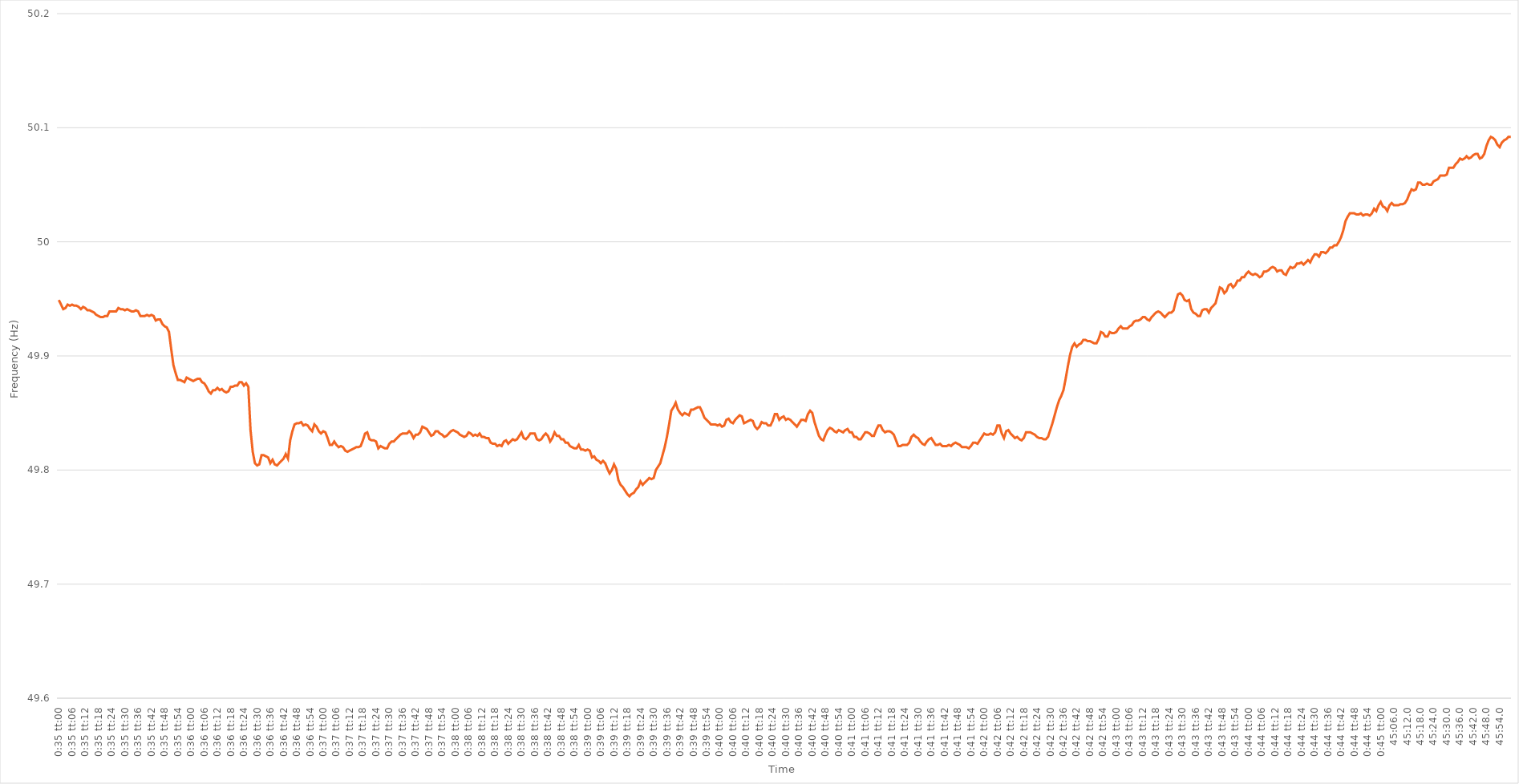
| Category | Series 0 |
|---|---|
| 0.024305555555555556 | 49.949 |
| 0.02431712962962963 | 49.945 |
| 0.024328703703703703 | 49.941 |
| 0.024340277777777777 | 49.942 |
| 0.024351851851851857 | 49.945 |
| 0.024363425925925927 | 49.944 |
| 0.024375000000000004 | 49.945 |
| 0.024386574074074074 | 49.944 |
| 0.024398148148148145 | 49.944 |
| 0.02440972222222222 | 49.943 |
| 0.02442129629629629 | 49.941 |
| 0.02443287037037037 | 49.943 |
| 0.024444444444444446 | 49.942 |
| 0.02445601851851852 | 49.94 |
| 0.024467592592592593 | 49.94 |
| 0.024479166666666666 | 49.939 |
| 0.02449074074074074 | 49.938 |
| 0.024502314814814814 | 49.936 |
| 0.024513888888888887 | 49.935 |
| 0.024525462962962968 | 49.934 |
| 0.024537037037037038 | 49.934 |
| 0.024548611111111115 | 49.935 |
| 0.024560185185185185 | 49.935 |
| 0.024571759259259262 | 49.939 |
| 0.024583333333333332 | 49.939 |
| 0.02459490740740741 | 49.939 |
| 0.02460648148148148 | 49.939 |
| 0.02461805555555556 | 49.942 |
| 0.02462962962962963 | 49.941 |
| 0.024641203703703703 | 49.941 |
| 0.024652777777777777 | 49.94 |
| 0.02466435185185185 | 49.941 |
| 0.024675925925925924 | 49.94 |
| 0.024687499999999998 | 49.939 |
| 0.024699074074074078 | 49.939 |
| 0.024710648148148148 | 49.94 |
| 0.024722222222222225 | 49.939 |
| 0.024733796296296295 | 49.935 |
| 0.024745370370370372 | 49.935 |
| 0.024756944444444443 | 49.935 |
| 0.02476851851851852 | 49.936 |
| 0.02478009259259259 | 49.935 |
| 0.02479166666666667 | 49.936 |
| 0.02480324074074074 | 49.935 |
| 0.024814814814814817 | 49.931 |
| 0.024826388888888887 | 49.932 |
| 0.024837962962962964 | 49.932 |
| 0.024849537037037035 | 49.928 |
| 0.024861111111111108 | 49.926 |
| 0.02487268518518519 | 49.925 |
| 0.02488425925925926 | 49.921 |
| 0.024895833333333336 | 49.906 |
| 0.024907407407407406 | 49.892 |
| 0.024918981481481483 | 49.885 |
| 0.024930555555555553 | 49.879 |
| 0.02494212962962963 | 49.879 |
| 0.0249537037037037 | 49.878 |
| 0.02496527777777778 | 49.877 |
| 0.02497685185185185 | 49.881 |
| 0.024988425925925928 | 49.88 |
| 0.024999999999999998 | 49.879 |
| 0.025011574074074075 | 49.878 |
| 0.025023148148148145 | 49.879 |
| 0.025034722222222222 | 49.88 |
| 0.0250462962962963 | 49.88 |
| 0.025057870370370373 | 49.877 |
| 0.025069444444444446 | 49.876 |
| 0.02508101851851852 | 49.873 |
| 0.025092592592592593 | 49.869 |
| 0.025104166666666664 | 49.867 |
| 0.02511574074074074 | 49.87 |
| 0.02512731481481481 | 49.87 |
| 0.02513888888888889 | 49.872 |
| 0.02515046296296296 | 49.87 |
| 0.02516203703703704 | 49.871 |
| 0.02517361111111111 | 49.869 |
| 0.025185185185185185 | 49.868 |
| 0.025196759259259256 | 49.869 |
| 0.025208333333333333 | 49.873 |
| 0.02521990740740741 | 49.873 |
| 0.025231481481481483 | 49.874 |
| 0.025243055555555557 | 49.874 |
| 0.02525462962962963 | 49.877 |
| 0.025266203703703704 | 49.877 |
| 0.025277777777777777 | 49.874 |
| 0.02528935185185185 | 49.876 |
| 0.025300925925925925 | 49.873 |
| 0.0253125 | 49.835 |
| 0.02532407407407408 | 49.816 |
| 0.02533564814814815 | 49.806 |
| 0.02534722222222222 | 49.804 |
| 0.025358796296296296 | 49.805 |
| 0.025370370370370366 | 49.813 |
| 0.025381944444444443 | 49.813 |
| 0.02539351851851852 | 49.812 |
| 0.025405092592592594 | 49.811 |
| 0.025416666666666667 | 49.806 |
| 0.02542824074074074 | 49.809 |
| 0.025439814814814814 | 49.805 |
| 0.025451388888888888 | 49.804 |
| 0.02546296296296296 | 49.806 |
| 0.025474537037037035 | 49.808 |
| 0.025486111111111112 | 49.81 |
| 0.02549768518518519 | 49.814 |
| 0.02550925925925926 | 49.81 |
| 0.025520833333333336 | 49.826 |
| 0.025532407407407406 | 49.834 |
| 0.025543981481481483 | 49.84 |
| 0.025555555555555554 | 49.841 |
| 0.025567129629629634 | 49.841 |
| 0.025578703703703704 | 49.842 |
| 0.025590277777777778 | 49.839 |
| 0.02560185185185185 | 49.84 |
| 0.025613425925925925 | 49.839 |
| 0.025625 | 49.836 |
| 0.025636574074074072 | 49.834 |
| 0.025648148148148146 | 49.84 |
| 0.025659722222222223 | 49.838 |
| 0.0256712962962963 | 49.834 |
| 0.02568287037037037 | 49.832 |
| 0.025694444444444447 | 49.834 |
| 0.025706018518518517 | 49.833 |
| 0.025717592592592594 | 49.828 |
| 0.025729166666666664 | 49.822 |
| 0.025740740740740745 | 49.822 |
| 0.025752314814814815 | 49.825 |
| 0.02576388888888889 | 49.822 |
| 0.025775462962962962 | 49.82 |
| 0.02578703703703704 | 49.821 |
| 0.02579861111111111 | 49.82 |
| 0.025810185185185183 | 49.817 |
| 0.025821759259259256 | 49.816 |
| 0.025833333333333333 | 49.817 |
| 0.02584490740740741 | 49.818 |
| 0.02585648148148148 | 49.819 |
| 0.025868055555555557 | 49.82 |
| 0.025879629629629627 | 49.82 |
| 0.025891203703703704 | 49.821 |
| 0.025902777777777775 | 49.826 |
| 0.025914351851851855 | 49.832 |
| 0.025925925925925925 | 49.833 |
| 0.025937500000000002 | 49.827 |
| 0.025949074074074072 | 49.826 |
| 0.02596064814814815 | 49.826 |
| 0.02597222222222222 | 49.825 |
| 0.025983796296296297 | 49.819 |
| 0.025995370370370367 | 49.821 |
| 0.026006944444444447 | 49.82 |
| 0.02601851851851852 | 49.819 |
| 0.026030092592592594 | 49.819 |
| 0.026041666666666668 | 49.823 |
| 0.026053240740740738 | 49.825 |
| 0.026064814814814815 | 49.825 |
| 0.026076388888888885 | 49.827 |
| 0.026087962962962966 | 49.829 |
| 0.026099537037037036 | 49.831 |
| 0.026111111111111113 | 49.832 |
| 0.026122685185185183 | 49.832 |
| 0.02613425925925926 | 49.832 |
| 0.02614583333333333 | 49.834 |
| 0.026157407407407407 | 49.832 |
| 0.026168981481481477 | 49.828 |
| 0.026180555555555558 | 49.831 |
| 0.02619212962962963 | 49.831 |
| 0.026203703703703705 | 49.833 |
| 0.02621527777777778 | 49.838 |
| 0.026226851851851852 | 49.837 |
| 0.026238425925925925 | 49.836 |
| 0.02625 | 49.833 |
| 0.026261574074074076 | 49.83 |
| 0.026273148148148153 | 49.831 |
| 0.026284722222222223 | 49.834 |
| 0.026296296296296293 | 49.834 |
| 0.02630787037037037 | 49.832 |
| 0.02631944444444444 | 49.831 |
| 0.026331018518518517 | 49.829 |
| 0.026342592592592588 | 49.83 |
| 0.026354166666666668 | 49.832 |
| 0.02636574074074074 | 49.834 |
| 0.026377314814814815 | 49.835 |
| 0.02638888888888889 | 49.834 |
| 0.026400462962962962 | 49.833 |
| 0.026412037037037036 | 49.831 |
| 0.02642361111111111 | 49.83 |
| 0.026435185185185187 | 49.829 |
| 0.026446759259259264 | 49.83 |
| 0.026458333333333334 | 49.833 |
| 0.02646990740740741 | 49.832 |
| 0.02648148148148148 | 49.83 |
| 0.026493055555555558 | 49.831 |
| 0.026504629629629628 | 49.83 |
| 0.026516203703703698 | 49.832 |
| 0.02652777777777778 | 49.829 |
| 0.026539351851851852 | 49.829 |
| 0.026550925925925926 | 49.828 |
| 0.0265625 | 49.828 |
| 0.026574074074074073 | 49.824 |
| 0.026585648148148146 | 49.823 |
| 0.02659722222222222 | 49.823 |
| 0.026608796296296297 | 49.821 |
| 0.026620370370370374 | 49.822 |
| 0.026631944444444444 | 49.821 |
| 0.02664351851851852 | 49.825 |
| 0.02665509259259259 | 49.826 |
| 0.02666666666666667 | 49.823 |
| 0.02667824074074074 | 49.825 |
| 0.026689814814814816 | 49.827 |
| 0.02670138888888889 | 49.826 |
| 0.026712962962962966 | 49.827 |
| 0.026724537037037036 | 49.83 |
| 0.026736111111111113 | 49.833 |
| 0.026747685185185183 | 49.828 |
| 0.026759259259259257 | 49.827 |
| 0.02677083333333333 | 49.829 |
| 0.026782407407407408 | 49.832 |
| 0.026793981481481485 | 49.832 |
| 0.026805555555555555 | 49.832 |
| 0.02681712962962963 | 49.827 |
| 0.026828703703703702 | 49.826 |
| 0.02684027777777778 | 49.827 |
| 0.02685185185185185 | 49.83 |
| 0.026863425925925926 | 49.832 |
| 0.026875 | 49.83 |
| 0.026886574074074077 | 49.825 |
| 0.026898148148148147 | 49.828 |
| 0.026909722222222224 | 49.833 |
| 0.026921296296296294 | 49.83 |
| 0.02693287037037037 | 49.83 |
| 0.02694444444444444 | 49.827 |
| 0.02695601851851852 | 49.827 |
| 0.026967592592592595 | 49.824 |
| 0.02697916666666667 | 49.824 |
| 0.026990740740740742 | 49.821 |
| 0.027002314814814812 | 49.82 |
| 0.02701388888888889 | 49.819 |
| 0.02702546296296296 | 49.819 |
| 0.027037037037037037 | 49.822 |
| 0.02704861111111111 | 49.818 |
| 0.027060185185185187 | 49.818 |
| 0.027071759259259257 | 49.817 |
| 0.027083333333333334 | 49.818 |
| 0.027094907407407404 | 49.817 |
| 0.02710648148148148 | 49.811 |
| 0.02711805555555555 | 49.812 |
| 0.027129629629629632 | 49.809 |
| 0.027141203703703706 | 49.808 |
| 0.02715277777777778 | 49.806 |
| 0.027164351851851853 | 49.808 |
| 0.027175925925925926 | 49.806 |
| 0.0271875 | 49.801 |
| 0.027199074074074073 | 49.797 |
| 0.027210648148148147 | 49.8 |
| 0.027222222222222228 | 49.805 |
| 0.027233796296296298 | 49.801 |
| 0.027245370370370368 | 49.791 |
| 0.027256944444444445 | 49.787 |
| 0.027268518518518515 | 49.785 |
| 0.027280092592592592 | 49.782 |
| 0.027291666666666662 | 49.779 |
| 0.027303240740740743 | 49.777 |
| 0.027314814814814816 | 49.779 |
| 0.02732638888888889 | 49.78 |
| 0.027337962962962963 | 49.783 |
| 0.027349537037037037 | 49.785 |
| 0.02736111111111111 | 49.79 |
| 0.027372685185185184 | 49.787 |
| 0.027384259259259257 | 49.789 |
| 0.027395833333333338 | 49.791 |
| 0.027407407407407408 | 49.793 |
| 0.027418981481481485 | 49.792 |
| 0.027430555555555555 | 49.793 |
| 0.027442129629629632 | 49.8 |
| 0.027453703703703702 | 49.803 |
| 0.027465277777777772 | 49.806 |
| 0.027476851851851853 | 49.813 |
| 0.027488425925925927 | 49.82 |
| 0.0275 | 49.829 |
| 0.027511574074074074 | 49.84 |
| 0.027523148148148147 | 49.852 |
| 0.02753472222222222 | 49.855 |
| 0.027546296296296294 | 49.859 |
| 0.027557870370370368 | 49.853 |
| 0.02756944444444445 | 49.85 |
| 0.02758101851851852 | 49.848 |
| 0.027592592592592596 | 49.85 |
| 0.027604166666666666 | 49.849 |
| 0.027615740740740743 | 49.848 |
| 0.027627314814814813 | 49.853 |
| 0.02763888888888889 | 49.853 |
| 0.027650462962962963 | 49.854 |
| 0.02766203703703704 | 49.855 |
| 0.02767361111111111 | 49.855 |
| 0.027685185185185188 | 49.851 |
| 0.027696759259259258 | 49.846 |
| 0.02770833333333333 | 49.844 |
| 0.027719907407407405 | 49.842 |
| 0.02773148148148148 | 49.84 |
| 0.02774305555555556 | 49.84 |
| 0.02775462962962963 | 49.84 |
| 0.027766203703703706 | 49.839 |
| 0.027777777777777776 | 49.84 |
| 0.027789351851851853 | 49.838 |
| 0.027800925925925923 | 49.839 |
| 0.0278125 | 49.844 |
| 0.027824074074074074 | 49.845 |
| 0.02783564814814815 | 49.842 |
| 0.02784722222222222 | 49.841 |
| 0.027858796296296298 | 49.844 |
| 0.02787037037037037 | 49.846 |
| 0.027881944444444445 | 49.848 |
| 0.027893518518518515 | 49.847 |
| 0.027905092592592592 | 49.841 |
| 0.02791666666666667 | 49.842 |
| 0.027928240740740743 | 49.843 |
| 0.027939814814814817 | 49.844 |
| 0.027951388888888887 | 49.843 |
| 0.027962962962962964 | 49.838 |
| 0.027974537037037034 | 49.836 |
| 0.02798611111111111 | 49.838 |
| 0.027997685185185184 | 49.842 |
| 0.02800925925925926 | 49.841 |
| 0.02802083333333333 | 49.841 |
| 0.02803240740740741 | 49.839 |
| 0.02804398148148148 | 49.839 |
| 0.028055555555555556 | 49.843 |
| 0.028067129629629626 | 49.849 |
| 0.028078703703703703 | 49.849 |
| 0.02809027777777778 | 49.844 |
| 0.028101851851851854 | 49.846 |
| 0.028113425925925927 | 49.847 |
| 0.028125 | 49.844 |
| 0.028136574074074074 | 49.845 |
| 0.028148148148148148 | 49.844 |
| 0.02815972222222222 | 49.842 |
| 0.028171296296296302 | 49.84 |
| 0.028182870370370372 | 49.838 |
| 0.028194444444444442 | 49.841 |
| 0.02820601851851852 | 49.844 |
| 0.02821759259259259 | 49.844 |
| 0.028229166666666666 | 49.843 |
| 0.028240740740740736 | 49.849 |
| 0.028252314814814813 | 49.852 |
| 0.02826388888888889 | 49.85 |
| 0.028275462962962964 | 49.842 |
| 0.028287037037037038 | 49.836 |
| 0.02829861111111111 | 49.83 |
| 0.028310185185185185 | 49.827 |
| 0.02832175925925926 | 49.826 |
| 0.028333333333333332 | 49.831 |
| 0.028344907407407412 | 49.835 |
| 0.028356481481481483 | 49.837 |
| 0.02836805555555556 | 49.836 |
| 0.02837962962962963 | 49.834 |
| 0.028391203703703707 | 49.833 |
| 0.028402777777777777 | 49.835 |
| 0.028414351851851847 | 49.834 |
| 0.028425925925925924 | 49.833 |
| 0.0284375 | 49.835 |
| 0.028449074074074075 | 49.836 |
| 0.028460648148148148 | 49.833 |
| 0.02847222222222222 | 49.833 |
| 0.028483796296296295 | 49.829 |
| 0.02849537037037037 | 49.829 |
| 0.028506944444444442 | 49.827 |
| 0.028518518518518523 | 49.827 |
| 0.028530092592592593 | 49.83 |
| 0.02854166666666667 | 49.833 |
| 0.02855324074074074 | 49.833 |
| 0.028564814814814817 | 49.832 |
| 0.028576388888888887 | 49.83 |
| 0.028587962962962964 | 49.83 |
| 0.028599537037037034 | 49.835 |
| 0.028611111111111115 | 49.839 |
| 0.028622685185185185 | 49.839 |
| 0.028634259259259262 | 49.835 |
| 0.028645833333333332 | 49.833 |
| 0.028657407407407406 | 49.834 |
| 0.02866898148148148 | 49.834 |
| 0.028680555555555553 | 49.833 |
| 0.028692129629629633 | 49.831 |
| 0.028703703703703703 | 49.826 |
| 0.02871527777777778 | 49.821 |
| 0.02872685185185185 | 49.821 |
| 0.028738425925925928 | 49.822 |
| 0.028749999999999998 | 49.822 |
| 0.028761574074074075 | 49.822 |
| 0.028773148148148145 | 49.824 |
| 0.028784722222222225 | 49.829 |
| 0.028796296296296296 | 49.831 |
| 0.028807870370370373 | 49.829 |
| 0.028819444444444443 | 49.828 |
| 0.02883101851851852 | 49.825 |
| 0.02884259259259259 | 49.823 |
| 0.028854166666666667 | 49.822 |
| 0.028865740740740744 | 49.825 |
| 0.028877314814814817 | 49.827 |
| 0.02888888888888889 | 49.828 |
| 0.02890046296296296 | 49.825 |
| 0.028912037037037038 | 49.822 |
| 0.02892361111111111 | 49.822 |
| 0.028935185185185185 | 49.823 |
| 0.028946759259259255 | 49.821 |
| 0.028958333333333336 | 49.821 |
| 0.028969907407407406 | 49.821 |
| 0.028981481481481483 | 49.822 |
| 0.028993055555555553 | 49.821 |
| 0.02900462962962963 | 49.823 |
| 0.0290162037037037 | 49.824 |
| 0.029027777777777777 | 49.823 |
| 0.029039351851851854 | 49.822 |
| 0.029050925925925928 | 49.82 |
| 0.0290625 | 49.82 |
| 0.029074074074074075 | 49.82 |
| 0.02908564814814815 | 49.819 |
| 0.029097222222222222 | 49.821 |
| 0.029108796296296296 | 49.824 |
| 0.029120370370370366 | 49.824 |
| 0.029131944444444446 | 49.823 |
| 0.029143518518518517 | 49.826 |
| 0.029155092592592594 | 49.829 |
| 0.029166666666666664 | 49.832 |
| 0.02917824074074074 | 49.831 |
| 0.02918981481481481 | 49.831 |
| 0.029201388888888888 | 49.832 |
| 0.029212962962962965 | 49.831 |
| 0.02922453703703704 | 49.833 |
| 0.029236111111111112 | 49.839 |
| 0.029247685185185186 | 49.839 |
| 0.02925925925925926 | 49.832 |
| 0.029270833333333333 | 49.828 |
| 0.029282407407407406 | 49.834 |
| 0.02929398148148148 | 49.835 |
| 0.029305555555555557 | 49.832 |
| 0.029317129629629634 | 49.83 |
| 0.029328703703703704 | 49.828 |
| 0.02934027777777778 | 49.829 |
| 0.02935185185185185 | 49.827 |
| 0.02936342592592592 | 49.826 |
| 0.029375 | 49.828 |
| 0.029386574074074075 | 49.833 |
| 0.02939814814814815 | 49.833 |
| 0.029409722222222223 | 49.833 |
| 0.029421296296296296 | 49.832 |
| 0.02943287037037037 | 49.831 |
| 0.029444444444444443 | 49.829 |
| 0.029456018518518517 | 49.828 |
| 0.02946759259259259 | 49.828 |
| 0.029479166666666667 | 49.827 |
| 0.029490740740740744 | 49.827 |
| 0.029502314814814815 | 49.829 |
| 0.02951388888888889 | 49.835 |
| 0.02952546296296296 | 49.841 |
| 0.02953703703703704 | 49.848 |
| 0.02954861111111111 | 49.855 |
| 0.02956018518518519 | 49.861 |
| 0.02957175925925926 | 49.865 |
| 0.029583333333333336 | 49.87 |
| 0.029594907407407407 | 49.88 |
| 0.02960648148148148 | 49.891 |
| 0.029618055555555554 | 49.901 |
| 0.029629629629629627 | 49.908 |
| 0.0296412037037037 | 49.911 |
| 0.029652777777777778 | 49.908 |
| 0.029664351851851855 | 49.91 |
| 0.029675925925925925 | 49.911 |
| 0.029687500000000002 | 49.914 |
| 0.029699074074074072 | 49.914 |
| 0.02971064814814815 | 49.913 |
| 0.02972222222222222 | 49.913 |
| 0.0297337962962963 | 49.912 |
| 0.02974537037037037 | 49.911 |
| 0.029756944444444447 | 49.911 |
| 0.029768518518518517 | 49.915 |
| 0.029780092592592594 | 49.921 |
| 0.029791666666666664 | 49.92 |
| 0.02980324074074074 | 49.917 |
| 0.02981481481481481 | 49.917 |
| 0.029826388888888892 | 49.921 |
| 0.029837962962962965 | 49.92 |
| 0.029849537037037036 | 49.92 |
| 0.029861111111111113 | 49.921 |
| 0.029872685185185183 | 49.924 |
| 0.02988425925925926 | 49.926 |
| 0.02989583333333333 | 49.924 |
| 0.02990740740740741 | 49.924 |
| 0.02991898148148148 | 49.924 |
| 0.029930555555555557 | 49.926 |
| 0.029942129629629628 | 49.927 |
| 0.029953703703703705 | 49.93 |
| 0.029965277777777775 | 49.931 |
| 0.029976851851851852 | 49.931 |
| 0.029988425925925922 | 49.932 |
| 0.030000000000000002 | 49.934 |
| 0.030011574074074076 | 49.934 |
| 0.03002314814814815 | 49.932 |
| 0.030034722222222223 | 49.931 |
| 0.030046296296296297 | 49.934 |
| 0.03005787037037037 | 49.936 |
| 0.03006944444444444 | 49.938 |
| 0.03008101851851852 | 49.939 |
| 0.03009259259259259 | 49.938 |
| 0.030104166666666668 | 49.936 |
| 0.030115740740740738 | 49.934 |
| 0.030127314814814815 | 49.936 |
| 0.030138888888888885 | 49.938 |
| 0.030150462962962962 | 49.938 |
| 0.030162037037037032 | 49.94 |
| 0.030173611111111113 | 49.948 |
| 0.030185185185185186 | 49.954 |
| 0.03019675925925926 | 49.955 |
| 0.030208333333333334 | 49.953 |
| 0.030219907407407407 | 49.949 |
| 0.03023148148148148 | 49.948 |
| 0.030243055555555554 | 49.949 |
| 0.03025462962962963 | 49.941 |
| 0.03026620370370371 | 49.938 |
| 0.03027777777777778 | 49.937 |
| 0.030289351851851855 | 49.935 |
| 0.030300925925925926 | 49.935 |
| 0.030312499999999996 | 49.94 |
| 0.030324074074074073 | 49.941 |
| 0.030335648148148143 | 49.941 |
| 0.030347222222222223 | 49.938 |
| 0.030358796296296297 | 49.942 |
| 0.03037037037037037 | 49.944 |
| 0.030381944444444444 | 49.946 |
| 0.030393518518518518 | 49.953 |
| 0.03040509259259259 | 49.96 |
| 0.030416666666666665 | 49.959 |
| 0.030428240740740742 | 49.955 |
| 0.03043981481481482 | 49.957 |
| 0.03045138888888889 | 49.962 |
| 0.030462962962962966 | 49.963 |
| 0.030474537037037036 | 49.96 |
| 0.030486111111111113 | 49.962 |
| 0.030497685185185183 | 49.966 |
| 0.03050925925925926 | 49.966 |
| 0.030520833333333334 | 49.969 |
| 0.03053240740740741 | 49.969 |
| 0.03054398148148148 | 49.972 |
| 0.030555555555555555 | 49.974 |
| 0.030567129629629628 | 49.972 |
| 0.0305787037037037 | 49.971 |
| 0.030590277777777775 | 49.972 |
| 0.030601851851851852 | 49.971 |
| 0.03061342592592593 | 49.969 |
| 0.030625 | 49.97 |
| 0.030636574074074076 | 49.974 |
| 0.030648148148148147 | 49.974 |
| 0.030659722222222224 | 49.975 |
| 0.030671296296296294 | 49.977 |
| 0.03068287037037037 | 49.978 |
| 0.030694444444444444 | 49.977 |
| 0.03070601851851852 | 49.974 |
| 0.03071759259259259 | 49.975 |
| 0.03072916666666667 | 49.975 |
| 0.03074074074074074 | 49.972 |
| 0.030752314814814816 | 49.971 |
| 0.030763888888888886 | 49.975 |
| 0.030775462962962966 | 49.978 |
| 0.03078703703703704 | 49.977 |
| 0.03079861111111111 | 49.978 |
| 0.030810185185185187 | 49.981 |
| 0.030821759259259257 | 49.981 |
| 0.030833333333333334 | 49.982 |
| 0.030844907407407404 | 49.98 |
| 0.03085648148148148 | 49.982 |
| 0.030868055555555555 | 49.984 |
| 0.030879629629629632 | 49.982 |
| 0.030891203703703702 | 49.986 |
| 0.03090277777777778 | 49.989 |
| 0.03091435185185185 | 49.989 |
| 0.030925925925925926 | 49.987 |
| 0.030937499999999996 | 49.991 |
| 0.030949074074074077 | 49.991 |
| 0.03096064814814815 | 49.99 |
| 0.030972222222222224 | 49.992 |
| 0.030983796296296297 | 49.995 |
| 0.03099537037037037 | 49.995 |
| 0.031006944444444445 | 49.997 |
| 0.031018518518518515 | 49.997 |
| 0.031030092592592592 | 50 |
| 0.031041666666666665 | 50.004 |
| 0.031053240740740742 | 50.01 |
| 0.031064814814814812 | 50.018 |
| 0.03107638888888889 | 50.022 |
| 0.03108796296296296 | 50.025 |
| 0.031099537037037037 | 50.025 |
| 0.031111111111111107 | 50.025 |
| 0.031122685185185187 | 50.024 |
| 0.03113425925925926 | 50.024 |
| 0.031145833333333334 | 50.025 |
| 0.031157407407407408 | 50.023 |
| 0.03116898148148148 | 50.024 |
| 0.031180555555555555 | 50.024 |
| 0.03119212962962963 | 50.023 |
| 0.031203703703703702 | 50.025 |
| 0.031215277777777783 | 50.029 |
| 0.031226851851851853 | 50.027 |
| 0.03123842592592593 | 50.032 |
| 0.03125 | 50.035 |
| 0.031261574074074074 | 50.031 |
| 0.03127314814814815 | 50.03 |
| 0.03128472222222222 | 50.027 |
| 0.0312962962962963 | 50.032 |
| 0.03130787037037037 | 50.034 |
| 0.03131944444444445 | 50.032 |
| 0.031331018518518515 | 50.032 |
| 0.031342592592592596 | 50.032 |
| 0.03135416666666666 | 50.033 |
| 0.03136574074074074 | 50.033 |
| 0.03137731481481481 | 50.034 |
| 0.03138888888888889 | 50.037 |
| 0.03140046296296296 | 50.042 |
| 0.03141203703703704 | 50.046 |
| 0.03142361111111111 | 50.045 |
| 0.031435185185185184 | 50.046 |
| 0.03144675925925926 | 50.052 |
| 0.03145833333333333 | 50.052 |
| 0.03146990740740741 | 50.05 |
| 0.031481481481481485 | 50.05 |
| 0.03149305555555556 | 50.051 |
| 0.031504629629629625 | 50.05 |
| 0.031516203703703706 | 50.05 |
| 0.03152777777777777 | 50.053 |
| 0.03153935185185185 | 50.054 |
| 0.03155092592592592 | 50.055 |
| 0.0315625 | 50.058 |
| 0.031574074074074074 | 50.058 |
| 0.03158564814814815 | 50.058 |
| 0.03159722222222222 | 50.059 |
| 0.031608796296296295 | 50.065 |
| 0.03162037037037037 | 50.065 |
| 0.03163194444444444 | 50.065 |
| 0.03164351851851852 | 50.068 |
| 0.031655092592592596 | 50.07 |
| 0.03166666666666667 | 50.073 |
| 0.03167824074074074 | 50.072 |
| 0.031689814814814816 | 50.073 |
| 0.03170138888888889 | 50.075 |
| 0.031712962962962964 | 50.073 |
| 0.03172453703703703 | 50.074 |
| 0.03173611111111111 | 50.076 |
| 0.031747685185185184 | 50.077 |
| 0.03175925925925926 | 50.077 |
| 0.03177083333333333 | 50.073 |
| 0.031782407407407405 | 50.074 |
| 0.03179398148148148 | 50.077 |
| 0.03180555555555555 | 50.084 |
| 0.03181712962962963 | 50.089 |
| 0.031828703703703706 | 50.092 |
| 0.03184027777777778 | 50.091 |
| 0.03185185185185185 | 50.089 |
| 0.03186342592592593 | 50.085 |
| 0.031875 | 50.083 |
| 0.031886574074074074 | 50.087 |
| 0.03189814814814815 | 50.089 |
| 0.03190972222222222 | 50.09 |
| 0.0319212962962963 | 50.092 |
| 0.03193287037037037 | 50.092 |